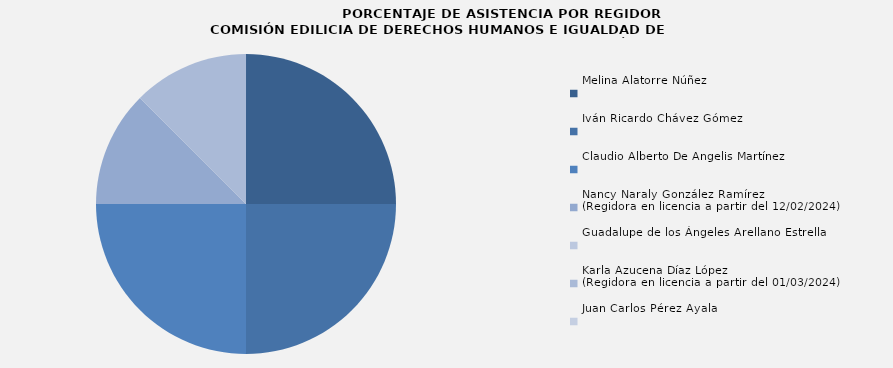
| Category | Melina Alatorre Núñez |
|---|---|
| Melina Alatorre Núñez | 100 |
| Iván Ricardo Chávez Gómez | 100 |
| Claudio Alberto De Angelis Martínez | 100 |
| Nancy Naraly González Ramírez
(Regidora en licencia a partir del 12/02/2024) | 50 |
| Guadalupe de los Ángeles Arellano Estrella  | 0 |
| Karla Azucena Díaz López
(Regidora en licencia a partir del 01/03/2024) | 50 |
| Juan Carlos Pérez Ayala | 0 |